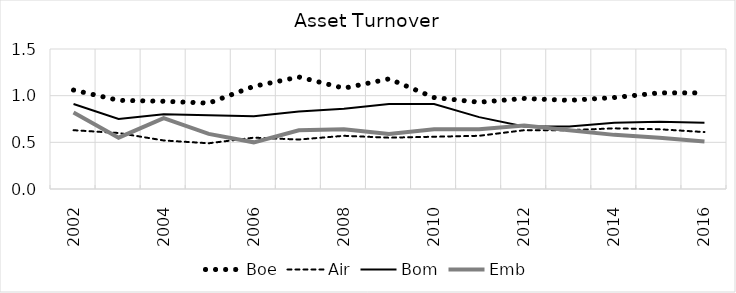
| Category | Boe | Air | Bom | Emb |
|---|---|---|---|---|
| 2002.0 | 1.06 | 0.63 | 0.91 | 0.82 |
| 2003.0 | 0.95 | 0.6 | 0.75 | 0.55 |
| 2004.0 | 0.94 | 0.52 | 0.8 | 0.76 |
| 2005.0 | 0.92 | 0.49 | 0.79 | 0.59 |
| 2006.0 | 1.1 | 0.55 | 0.78 | 0.5 |
| 2007.0 | 1.2 | 0.53 | 0.83 | 0.63 |
| 2008.0 | 1.08 | 0.57 | 0.86 | 0.64 |
| 2009.0 | 1.18 | 0.55 | 0.91 | 0.59 |
| 2010.0 | 0.98 | 0.56 | 0.91 | 0.64 |
| 2011.0 | 0.93 | 0.57 | 0.77 | 0.64 |
| 2012.0 | 0.97 | 0.63 | 0.67 | 0.68 |
| 2013.0 | 0.95 | 0.63 | 0.67 | 0.63 |
| 2014.0 | 0.98 | 0.65 | 0.71 | 0.58 |
| 2015.0 | 1.03 | 0.64 | 0.72 | 0.55 |
| 2016.0 | 1.03 | 0.61 | 0.71 | 0.51 |